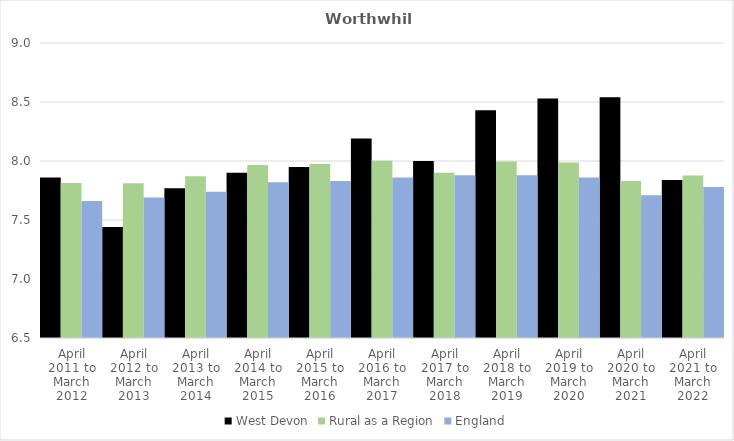
| Category | West Devon | Rural as a Region | England |
|---|---|---|---|
| April 2011 to March 2012 | 7.86 | 7.813 | 7.66 |
| April 2012 to March 2013 | 7.44 | 7.811 | 7.69 |
| April 2013 to March 2014 | 7.77 | 7.871 | 7.74 |
| April 2014 to March 2015 | 7.9 | 7.967 | 7.82 |
| April 2015 to March 2016 | 7.95 | 7.975 | 7.83 |
| April 2016 to March 2017 | 8.19 | 8.002 | 7.86 |
| April 2017 to March 2018 | 8 | 7.9 | 7.88 |
| April 2018 to March 2019 | 8.43 | 7.996 | 7.88 |
| April 2019 to March 2020 | 8.53 | 7.988 | 7.86 |
| April 2020 to March 2021 | 8.54 | 7.831 | 7.71 |
| April 2021 to March 2022 | 7.84 | 7.877 | 7.78 |